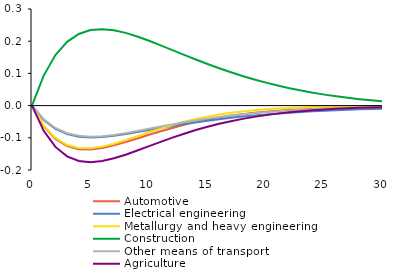
| Category | Automotive | Electrical engineering | Metallurgy and heavy engineering | Construction | Other means of transport | Agriculture |
|---|---|---|---|---|---|---|
| 0.0 | 0 | 0 | 0 | 0 | 0 | 0 |
| 1.0 | -0.064 | -0.044 | -0.062 | 0.093 | -0.042 | -0.078 |
| 2.0 | -0.104 | -0.072 | -0.101 | 0.157 | -0.07 | -0.128 |
| 3.0 | -0.126 | -0.088 | -0.122 | 0.198 | -0.086 | -0.158 |
| 4.0 | -0.136 | -0.096 | -0.132 | 0.222 | -0.094 | -0.172 |
| 5.0 | -0.137 | -0.099 | -0.133 | 0.234 | -0.096 | -0.176 |
| 6.0 | -0.132 | -0.097 | -0.127 | 0.237 | -0.095 | -0.172 |
| 7.0 | -0.124 | -0.094 | -0.118 | 0.234 | -0.091 | -0.164 |
| 8.0 | -0.113 | -0.088 | -0.107 | 0.226 | -0.085 | -0.152 |
| 9.0 | -0.102 | -0.082 | -0.095 | 0.215 | -0.079 | -0.14 |
| 10.0 | -0.091 | -0.076 | -0.083 | 0.201 | -0.072 | -0.126 |
| 11.0 | -0.08 | -0.069 | -0.071 | 0.187 | -0.065 | -0.112 |
| 12.0 | -0.069 | -0.063 | -0.06 | 0.172 | -0.058 | -0.099 |
| 13.0 | -0.06 | -0.057 | -0.05 | 0.158 | -0.052 | -0.087 |
| 14.0 | -0.051 | -0.052 | -0.042 | 0.143 | -0.046 | -0.076 |
| 15.0 | -0.044 | -0.047 | -0.034 | 0.129 | -0.04 | -0.066 |
| 16.0 | -0.037 | -0.042 | -0.028 | 0.116 | -0.035 | -0.057 |
| 17.0 | -0.032 | -0.038 | -0.022 | 0.104 | -0.031 | -0.048 |
| 18.0 | -0.027 | -0.034 | -0.018 | 0.092 | -0.027 | -0.041 |
| 19.0 | -0.022 | -0.031 | -0.014 | 0.081 | -0.023 | -0.035 |
| 20.0 | -0.019 | -0.028 | -0.011 | 0.071 | -0.02 | -0.03 |
| 21.0 | -0.016 | -0.025 | -0.009 | 0.062 | -0.018 | -0.025 |
| 22.0 | -0.013 | -0.022 | -0.007 | 0.054 | -0.015 | -0.021 |
| 23.0 | -0.011 | -0.02 | -0.006 | 0.047 | -0.013 | -0.018 |
| 24.0 | -0.01 | -0.018 | -0.005 | 0.04 | -0.011 | -0.015 |
| 25.0 | -0.008 | -0.016 | -0.004 | 0.034 | -0.01 | -0.012 |
| 26.0 | -0.007 | -0.014 | -0.003 | 0.029 | -0.008 | -0.01 |
| 27.0 | -0.006 | -0.013 | -0.003 | 0.024 | -0.007 | -0.008 |
| 28.0 | -0.005 | -0.012 | -0.002 | 0.02 | -0.006 | -0.007 |
| 29.0 | -0.004 | -0.01 | -0.002 | 0.016 | -0.005 | -0.006 |
| 30.0 | -0.004 | -0.009 | -0.002 | 0.013 | -0.004 | -0.005 |